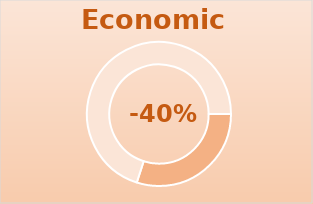
| Category | Series 0 |
|---|---|
| 0 | 0.6 |
| 1 | 1.4 |